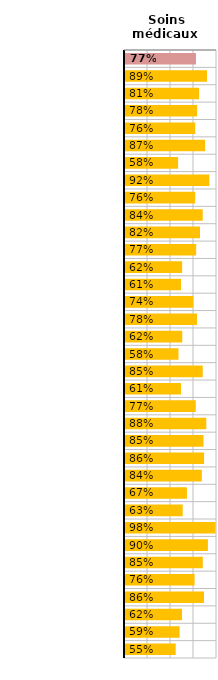
| Category | Soins médicaux ambulatoires |
|---|---|
| OCDE32 | 0.771 |
| Allemagne | 0.892 |
| Australie | 0.805 |
| Autriche | 0.783 |
| Belgique | 0.763 |
| Canada | 0.87 |
| Corée | 0.577 |
| Danemark | 0.917 |
| Espagne | 0.763 |
| Estonie | 0.845 |
| Finlande | 0.815 |
| France | 0.774 |
| Grèce | 0.621 |
| Hongrie | 0.609 |
| Irlande | 0.741 |
| Islande | 0.783 |
| Israël | 0.623 |
| Italie | 0.581 |
| Japon | 0.845 |
| Lettonie | 0.609 |
| Lituanie | 0.77 |
| Luxembourg | 0.884 |
| Mexique | 0.853 |
| Norvège | 0.86 |
| Pays-Bas | 0.835 |
| Pologne | 0.673 |
| Portugal | 0.627 |
| République slovaque | 0.985 |
| République tchèque | 0.901 |
| Royaume-Uni | 0.846 |
| Slovénie | 0.757 |
| Suède | 0.859 |
| Suisse | 0.62 |
| Costa Rica | 0.594 |
| Fédération de Russie | 0.551 |